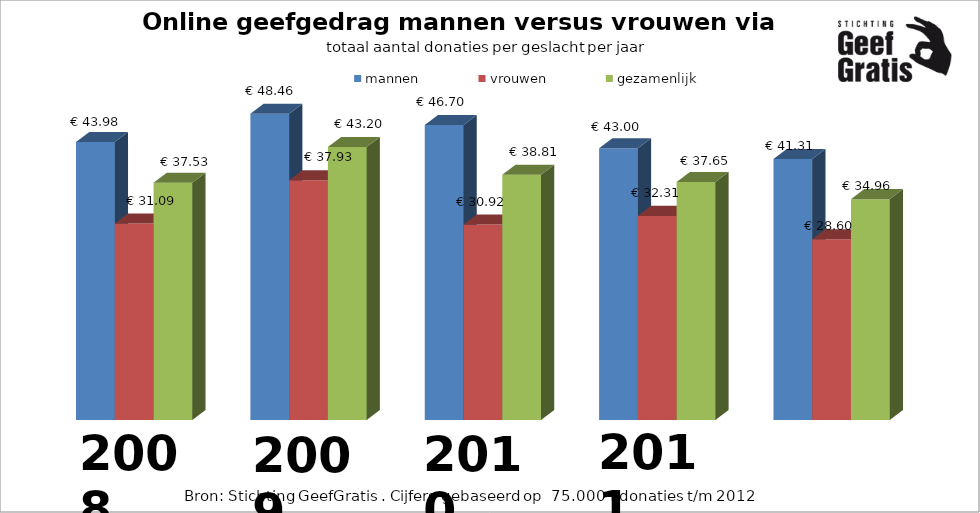
| Category | mannen | vrouwen | gezamenlijk |
|---|---|---|---|
| 0 | 43.983 | 31.085 | 37.534 |
| 1 | 48.464 | 37.931 | 43.198 |
| 2 | 46.703 | 30.924 | 38.814 |
| 3 | 42.996 | 32.306 | 37.651 |
| 4 | 41.314 | 28.6 | 34.957 |